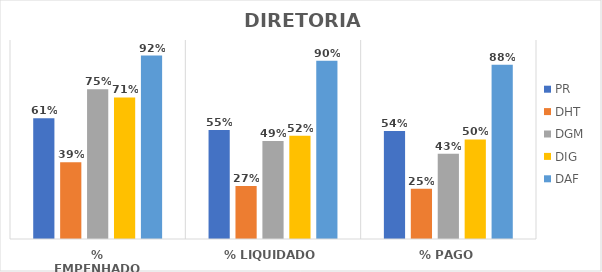
| Category | PR | DHT | DGM | DIG | DAF |
|---|---|---|---|---|---|
| % EMPENHADO | 0.607 | 0.386 | 0.752 | 0.711 | 0.922 |
| % LIQUIDADO | 0.548 | 0.266 | 0.492 | 0.519 | 0.896 |
| % PAGO | 0.543 | 0.253 | 0.428 | 0.501 | 0.875 |